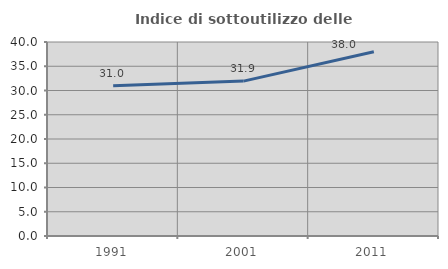
| Category | Indice di sottoutilizzo delle abitazioni  |
|---|---|
| 1991.0 | 30.992 |
| 2001.0 | 31.939 |
| 2011.0 | 37.993 |